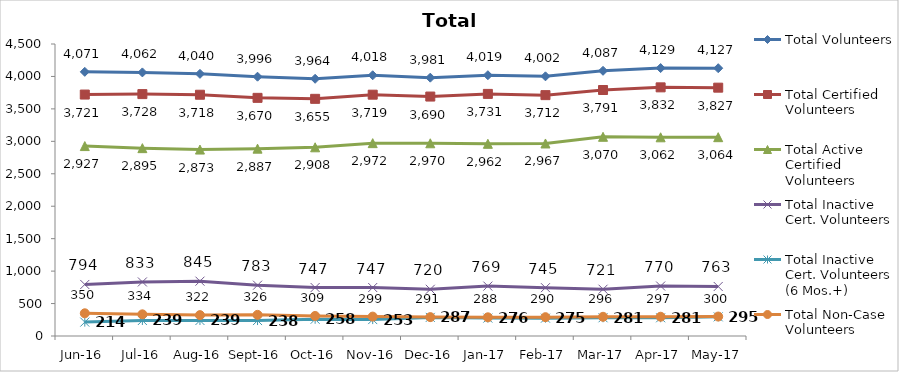
| Category | Total Volunteers | Total Certified Volunteers | Total Active Certified Volunteers | Total Inactive Cert. Volunteers | Total Inactive Cert. Volunteers (6 Mos.+) | Total Non-Case Volunteers |
|---|---|---|---|---|---|---|
| Jun-16 | 4071 | 3721 | 2927 | 794 | 214 | 350 |
| Jul-16 | 4062 | 3728 | 2895 | 833 | 239 | 334 |
| Aug-16 | 4040 | 3718 | 2873 | 845 | 239 | 322 |
| Sep-16 | 3996 | 3670 | 2887 | 783 | 238 | 326 |
| Oct-16 | 3964 | 3655 | 2908 | 747 | 258 | 309 |
| Nov-16 | 4018 | 3719 | 2972 | 747 | 253 | 299 |
| Dec-16 | 3981 | 3690 | 2970 | 720 | 287 | 291 |
| Jan-17 | 4019 | 3731 | 2962 | 769 | 276 | 288 |
| Feb-17 | 4002 | 3712 | 2967 | 745 | 275 | 290 |
| Mar-17 | 4087 | 3791 | 3070 | 721 | 281 | 296 |
| Apr-17 | 4129 | 3832 | 3062 | 770 | 281 | 297 |
| May-17 | 4127 | 3827 | 3064 | 763 | 295 | 300 |